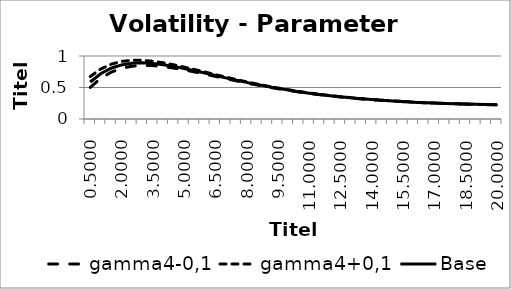
| Category | gamma4-0,1 | gamma4+0,1 | Base |
|---|---|---|---|
| 0.5 | 0.501 | 0.673 | 0.587 |
| 1.0 | 0.644 | 0.793 | 0.719 |
| 1.5 | 0.742 | 0.87 | 0.806 |
| 2.0 | 0.804 | 0.913 | 0.859 |
| 2.5 | 0.838 | 0.932 | 0.885 |
| 3.0 | 0.851 | 0.932 | 0.891 |
| 3.5 | 0.847 | 0.917 | 0.882 |
| 4.0 | 0.833 | 0.893 | 0.863 |
| 4.5 | 0.809 | 0.861 | 0.835 |
| 5.0 | 0.78 | 0.825 | 0.802 |
| 5.5 | 0.747 | 0.786 | 0.767 |
| 6.0 | 0.712 | 0.745 | 0.729 |
| 6.5 | 0.677 | 0.705 | 0.691 |
| 7.0 | 0.641 | 0.665 | 0.653 |
| 7.5 | 0.606 | 0.627 | 0.616 |
| 8.0 | 0.572 | 0.59 | 0.581 |
| 8.5 | 0.54 | 0.555 | 0.547 |
| 9.0 | 0.509 | 0.523 | 0.516 |
| 9.5 | 0.481 | 0.492 | 0.486 |
| 10.0 | 0.454 | 0.464 | 0.459 |
| 10.5 | 0.429 | 0.438 | 0.434 |
| 11.0 | 0.407 | 0.414 | 0.41 |
| 11.5 | 0.386 | 0.392 | 0.389 |
| 12.0 | 0.367 | 0.372 | 0.369 |
| 12.5 | 0.349 | 0.354 | 0.352 |
| 13.0 | 0.334 | 0.338 | 0.336 |
| 13.5 | 0.319 | 0.323 | 0.321 |
| 14.0 | 0.306 | 0.309 | 0.308 |
| 14.5 | 0.295 | 0.297 | 0.296 |
| 15.0 | 0.284 | 0.287 | 0.286 |
| 15.5 | 0.275 | 0.277 | 0.276 |
| 16.0 | 0.267 | 0.268 | 0.267 |
| 16.5 | 0.259 | 0.261 | 0.26 |
| 17.0 | 0.252 | 0.254 | 0.253 |
| 17.5 | 0.246 | 0.247 | 0.247 |
| 18.0 | 0.241 | 0.242 | 0.242 |
| 18.5 | 0.236 | 0.237 | 0.237 |
| 19.0 | 0.232 | 0.233 | 0.232 |
| 19.5 | 0.228 | 0.229 | 0.229 |
| 20.0 | 0.225 | 0.226 | 0.225 |